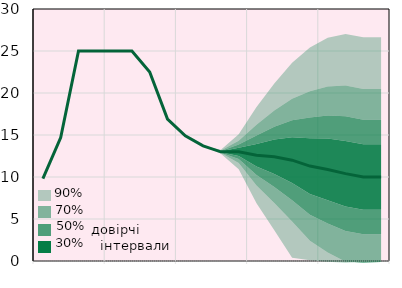
| Category | Облікова ставка, % |
|---|---|
|  | 9.8 |
|  | 14.7 |
|  | 25 |
| IV.22 | 25 |
|  | 25 |
|  | 25 |
|  | 22.5 |
| IV.23 | 16.9 |
|  | 14.9 |
|  | 13.7 |
|  | 13 |
| IV.24 | 13 |
|  | 12.6 |
|  | 12.4 |
|  | 12 |
| IV.25 | 11.3 |
|  | 10.9 |
|  | 10.4 |
|  | 10 |
| IV.26 | 10 |